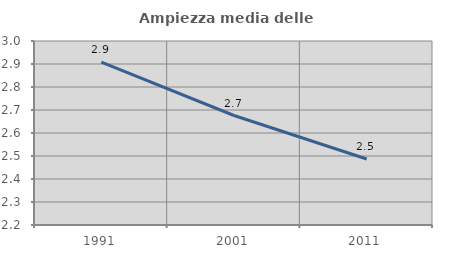
| Category | Ampiezza media delle famiglie |
|---|---|
| 1991.0 | 2.909 |
| 2001.0 | 2.676 |
| 2011.0 | 2.487 |